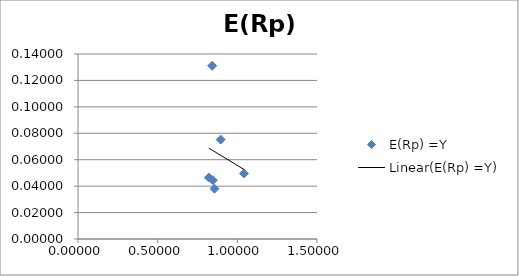
| Category | E(Rp) =Y |
|---|---|
| 0.8211785694792084 | 0.047 |
| 0.8566866946004241 | 0.038 |
| 0.8952893360935499 | 0.075 |
| 0.8422622495574565 | 0.131 |
| 0.8467426768905374 | 0.045 |
| 1.0419353364373314 | 0.05 |